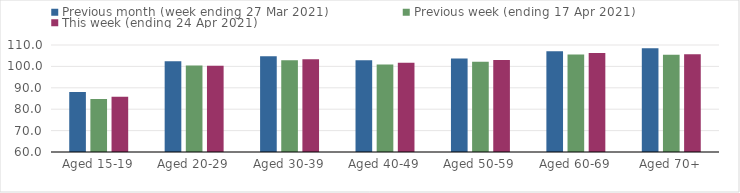
| Category | Previous month (week ending 27 Mar 2021) | Previous week (ending 17 Apr 2021) | This week (ending 24 Apr 2021) |
|---|---|---|---|
| Aged 15-19 | 87.99 | 84.79 | 85.83 |
| Aged 20-29 | 102.36 | 100.44 | 100.32 |
| Aged 30-39 | 104.78 | 102.93 | 103.32 |
| Aged 40-49 | 102.93 | 100.94 | 101.74 |
| Aged 50-59 | 103.72 | 102.12 | 102.95 |
| Aged 60-69 | 107.09 | 105.56 | 106.21 |
| Aged 70+ | 108.46 | 105.47 | 105.66 |